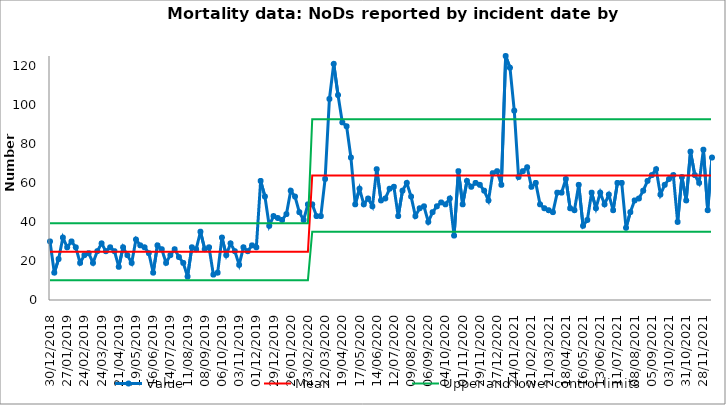
| Category | Value | Mean | Upper and lower control limits | Series 0 |
|---|---|---|---|---|
| 30/12/2018 | 30 | 24.708 | 39.278 | 10.138 |
| 06/01/2019 | 14 | 24.708 | 39.278 | 10.138 |
| 13/01/2019 | 21 | 24.708 | 39.278 | 10.138 |
| 20/01/2019 | 32 | 24.708 | 39.278 | 10.138 |
| 27/01/2019 | 27 | 24.708 | 39.278 | 10.138 |
| 03/02/2019 | 30 | 24.708 | 39.278 | 10.138 |
| 10/02/2019 | 27 | 24.708 | 39.278 | 10.138 |
| 17/02/2019 | 19 | 24.708 | 39.278 | 10.138 |
| 24/02/2019 | 23 | 24.708 | 39.278 | 10.138 |
| 03/03/2019 | 24 | 24.708 | 39.278 | 10.138 |
| 10/03/2019 | 19 | 24.708 | 39.278 | 10.138 |
| 17/03/2019 | 25 | 24.708 | 39.278 | 10.138 |
| 24/03/2019 | 29 | 24.708 | 39.278 | 10.138 |
| 31/03/2019 | 25 | 24.708 | 39.278 | 10.138 |
| 07/04/2019 | 27 | 24.708 | 39.278 | 10.138 |
| 14/04/2019 | 25 | 24.708 | 39.278 | 10.138 |
| 21/04/2019 | 17 | 24.708 | 39.278 | 10.138 |
| 28/04/2019 | 27 | 24.708 | 39.278 | 10.138 |
| 05/05/2019 | 23 | 24.708 | 39.278 | 10.138 |
| 12/05/2019 | 19 | 24.708 | 39.278 | 10.138 |
| 19/05/2019 | 31 | 24.708 | 39.278 | 10.138 |
| 26/05/2019 | 28 | 24.708 | 39.278 | 10.138 |
| 02/06/2019 | 27 | 24.708 | 39.278 | 10.138 |
| 09/06/2019 | 24 | 24.708 | 39.278 | 10.138 |
| 16/06/2019 | 14 | 24.708 | 39.278 | 10.138 |
| 23/06/2019 | 28 | 24.708 | 39.278 | 10.138 |
| 30/06/2019 | 26 | 24.708 | 39.278 | 10.138 |
| 07/07/2019 | 19 | 24.708 | 39.278 | 10.138 |
| 14/07/2019 | 23 | 24.708 | 39.278 | 10.138 |
| 21/07/2019 | 26 | 24.708 | 39.278 | 10.138 |
| 28/07/2019 | 22 | 24.708 | 39.278 | 10.138 |
| 04/08/2019 | 19 | 24.708 | 39.278 | 10.138 |
| 11/08/2019 | 12 | 24.708 | 39.278 | 10.138 |
| 18/08/2019 | 27 | 24.708 | 39.278 | 10.138 |
| 25/08/2019 | 26 | 24.708 | 39.278 | 10.138 |
| 01/09/2019 | 35 | 24.708 | 39.278 | 10.138 |
| 08/09/2019 | 26 | 24.708 | 39.278 | 10.138 |
| 15/09/2019 | 27 | 24.708 | 39.278 | 10.138 |
| 22/09/2019 | 13 | 24.708 | 39.278 | 10.138 |
| 29/09/2019 | 14 | 24.708 | 39.278 | 10.138 |
| 06/10/2019 | 32 | 24.708 | 39.278 | 10.138 |
| 13/10/2019 | 23 | 24.708 | 39.278 | 10.138 |
| 20/10/2019 | 29 | 24.708 | 39.278 | 10.138 |
| 27/10/2019 | 25 | 24.708 | 39.278 | 10.138 |
| 03/11/2019 | 18 | 24.708 | 39.278 | 10.138 |
| 10/11/2019 | 27 | 24.708 | 39.278 | 10.138 |
| 17/11/2019 | 25 | 24.708 | 39.278 | 10.138 |
| 24/11/2019 | 28 | 24.708 | 39.278 | 10.138 |
| 01/12/2019 | 27 | 24.708 | 39.278 | 10.138 |
| 08/12/2019 | 61 | 24.708 | 39.278 | 10.138 |
| 15/12/2019 | 53 | 24.708 | 39.278 | 10.138 |
| 22/12/2019 | 38 | 24.708 | 39.278 | 10.138 |
| 29/12/2019 | 43 | 24.708 | 39.278 | 10.138 |
| 05/01/2020 | 42 | 24.708 | 39.278 | 10.138 |
| 12/01/2020 | 41 | 24.708 | 39.278 | 10.138 |
| 19/01/2020 | 44 | 24.708 | 39.278 | 10.138 |
| 26/01/2020 | 56 | 24.708 | 39.278 | 10.138 |
| 02/02/2020 | 53 | 24.708 | 39.278 | 10.138 |
| 09/02/2020 | 45 | 24.708 | 39.278 | 10.138 |
| 16/02/2020 | 41 | 24.708 | 39.278 | 10.138 |
| 23/02/2020 | 49 | 24.708 | 39.278 | 10.138 |
| 01/03/2020 | 49 | 63.792 | 92.604 | 34.98 |
| 08/03/2020 | 43 | 63.792 | 92.604 | 34.98 |
| 15/03/2020 | 43 | 63.792 | 92.604 | 34.98 |
| 22/03/2020 | 62 | 63.792 | 92.604 | 34.98 |
| 29/03/2020 | 103 | 63.792 | 92.604 | 34.98 |
| 05/04/2020 | 121 | 63.792 | 92.604 | 34.98 |
| 12/04/2020 | 105 | 63.792 | 92.604 | 34.98 |
| 19/04/2020 | 91 | 63.792 | 92.604 | 34.98 |
| 26/04/2020 | 89 | 63.792 | 92.604 | 34.98 |
| 03/05/2020 | 73 | 63.792 | 92.604 | 34.98 |
| 10/05/2020 | 49 | 63.792 | 92.604 | 34.98 |
| 17/05/2020 | 57 | 63.792 | 92.604 | 34.98 |
| 24/05/2020 | 49 | 63.792 | 92.604 | 34.98 |
| 31/05/2020 | 52 | 63.792 | 92.604 | 34.98 |
| 07/06/2020 | 48 | 63.792 | 92.604 | 34.98 |
| 14/06/2020 | 67 | 63.792 | 92.604 | 34.98 |
| 21/06/2020 | 51 | 63.792 | 92.604 | 34.98 |
| 28/06/2020 | 52 | 63.792 | 92.604 | 34.98 |
| 05/07/2020 | 57 | 63.792 | 92.604 | 34.98 |
| 12/07/2020 | 58 | 63.792 | 92.604 | 34.98 |
| 19/07/2020 | 43 | 63.792 | 92.604 | 34.98 |
| 26/07/2020 | 56 | 63.792 | 92.604 | 34.98 |
| 02/08/2020 | 60 | 63.792 | 92.604 | 34.98 |
| 09/08/2020 | 53 | 63.792 | 92.604 | 34.98 |
| 16/08/2020 | 43 | 63.792 | 92.604 | 34.98 |
| 23/08/2020 | 47 | 63.792 | 92.604 | 34.98 |
| 30/08/2020 | 48 | 63.792 | 92.604 | 34.98 |
| 06/09/2020 | 40 | 63.792 | 92.604 | 34.98 |
| 13/09/2020 | 45 | 63.792 | 92.604 | 34.98 |
| 20/09/2020 | 48 | 63.792 | 92.604 | 34.98 |
| 27/09/2020 | 50 | 63.792 | 92.604 | 34.98 |
| 04/10/2020 | 49 | 63.792 | 92.604 | 34.98 |
| 11/10/2020 | 52 | 63.792 | 92.604 | 34.98 |
| 18/10/2020 | 33 | 63.792 | 92.604 | 34.98 |
| 25/10/2020 | 66 | 63.792 | 92.604 | 34.98 |
| 01/11/2020 | 49 | 63.792 | 92.604 | 34.98 |
| 08/11/2020 | 61 | 63.792 | 92.604 | 34.98 |
| 15/11/2020 | 58 | 63.792 | 92.604 | 34.98 |
| 22/11/2020 | 60 | 63.792 | 92.604 | 34.98 |
| 29/11/2020 | 59 | 63.792 | 92.604 | 34.98 |
| 06/12/2020 | 56 | 63.792 | 92.604 | 34.98 |
| 13/12/2020 | 51 | 63.792 | 92.604 | 34.98 |
| 20/12/2020 | 65 | 63.792 | 92.604 | 34.98 |
| 27/12/2020 | 66 | 63.792 | 92.604 | 34.98 |
| 03/01/2021 | 59 | 63.792 | 92.604 | 34.98 |
| 10/01/2021 | 125 | 63.792 | 92.604 | 34.98 |
| 17/01/2021 | 119 | 63.792 | 92.604 | 34.98 |
| 24/01/2021 | 97 | 63.792 | 92.604 | 34.98 |
| 31/01/2021 | 63 | 63.792 | 92.604 | 34.98 |
| 07/02/2021 | 66 | 63.792 | 92.604 | 34.98 |
| 14/02/2021 | 68 | 63.792 | 92.604 | 34.98 |
| 21/02/2021 | 58 | 63.792 | 92.604 | 34.98 |
| 28/02/2021 | 60 | 63.792 | 92.604 | 34.98 |
| 07/03/2021 | 49 | 63.792 | 92.604 | 34.98 |
| 14/03/2021 | 47 | 63.792 | 92.604 | 34.98 |
| 21/03/2021 | 46 | 63.792 | 92.604 | 34.98 |
| 28/03/2021 | 45 | 63.792 | 92.604 | 34.98 |
| 04/04/2021 | 55 | 63.792 | 92.604 | 34.98 |
| 11/04/2021 | 55 | 63.792 | 92.604 | 34.98 |
| 18/04/2021 | 62 | 63.792 | 92.604 | 34.98 |
| 25/04/2021 | 47 | 63.792 | 92.604 | 34.98 |
| 02/05/2021 | 46 | 63.792 | 92.604 | 34.98 |
| 09/05/2021 | 59 | 63.792 | 92.604 | 34.98 |
| 16/05/2021 | 38 | 63.792 | 92.604 | 34.98 |
| 23/05/2021 | 41 | 63.792 | 92.604 | 34.98 |
| 30/05/2021 | 55 | 63.792 | 92.604 | 34.98 |
| 06/06/2021 | 47 | 63.792 | 92.604 | 34.98 |
| 13/06/2021 | 55 | 63.792 | 92.604 | 34.98 |
| 20/06/2021 | 49 | 63.792 | 92.604 | 34.98 |
| 27/06/2021 | 54 | 63.792 | 92.604 | 34.98 |
| 04/07/2021 | 46 | 63.792 | 92.604 | 34.98 |
| 11/07/2021 | 60 | 63.792 | 92.604 | 34.98 |
| 18/07/2021 | 60 | 63.792 | 92.604 | 34.98 |
| 25/07/2021 | 37 | 63.792 | 92.604 | 34.98 |
| 01/08/2021 | 45 | 63.792 | 92.604 | 34.98 |
| 08/08/2021 | 51 | 63.792 | 92.604 | 34.98 |
| 15/08/2021 | 52 | 63.792 | 92.604 | 34.98 |
| 22/08/2021 | 56 | 63.792 | 92.604 | 34.98 |
| 29/08/2021 | 61 | 63.792 | 92.604 | 34.98 |
| 05/09/2021 | 64 | 63.792 | 92.604 | 34.98 |
| 12/09/2021 | 67 | 63.792 | 92.604 | 34.98 |
| 19/09/2021 | 54 | 63.792 | 92.604 | 34.98 |
| 26/09/2021 | 59 | 63.792 | 92.604 | 34.98 |
| 03/10/2021 | 62 | 63.792 | 92.604 | 34.98 |
| 10/10/2021 | 64 | 63.792 | 92.604 | 34.98 |
| 17/10/2021 | 40 | 63.792 | 92.604 | 34.98 |
| 24/10/2021 | 63 | 63.792 | 92.604 | 34.98 |
| 31/10/2021 | 51 | 63.792 | 92.604 | 34.98 |
| 07/11/2021 | 76 | 63.792 | 92.604 | 34.98 |
| 14/11/2021 | 64 | 63.792 | 92.604 | 34.98 |
| 21/11/2021 | 60 | 63.792 | 92.604 | 34.98 |
| 28/11/2021 | 77 | 63.792 | 92.604 | 34.98 |
| 05/12/2021 | 46 | 63.792 | 92.604 | 34.98 |
| 12/12/2021 | 73 | 63.792 | 92.604 | 34.98 |